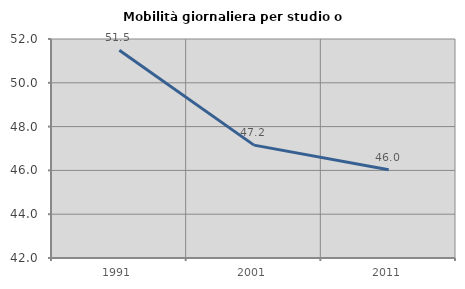
| Category | Mobilità giornaliera per studio o lavoro |
|---|---|
| 1991.0 | 51.486 |
| 2001.0 | 47.155 |
| 2011.0 | 46.029 |